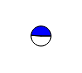
| Category | Series 0 |
|---|---|
| 0 | 3400420 |
| 1 | 3245597 |